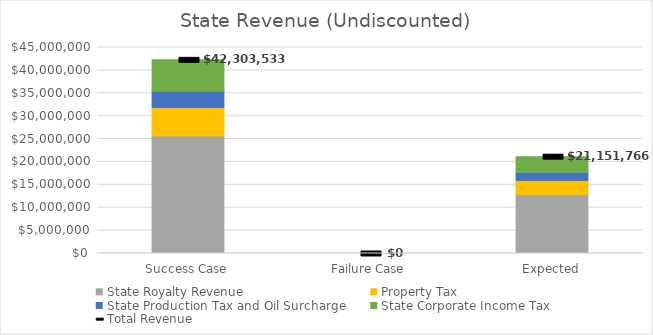
| Category | State Royalty Revenue | Property Tax | State Production Tax and Oil Surcharge | State Corporate Income Tax |
|---|---|---|---|---|
| Success Case | 25693402.929 | 6192769.932 | 3541491.029 | 6875868.96 |
| Failure Case | 0 | 0 | 0 | 0 |
| Expected | 12846701.464 | 3096384.966 | 1770745.514 | 3437934.48 |